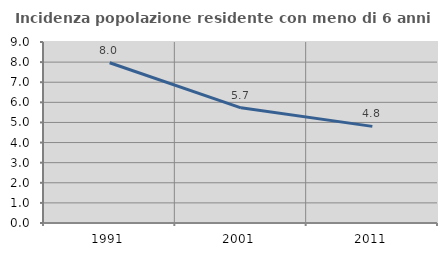
| Category | Incidenza popolazione residente con meno di 6 anni |
|---|---|
| 1991.0 | 7.967 |
| 2001.0 | 5.727 |
| 2011.0 | 4.805 |